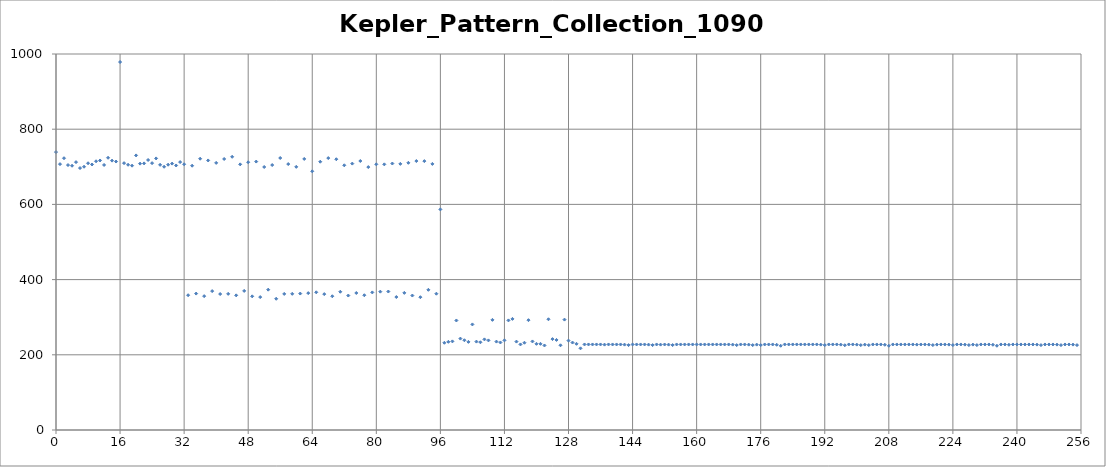
| Category | avg |
|---|---|
| 0.0 | 739.2 |
| 1.0 | 707.1 |
| 2.0 | 722.8 |
| 3.0 | 704.7 |
| 4.0 | 702.8 |
| 5.0 | 712.4 |
| 6.0 | 696.7 |
| 7.0 | 700.2 |
| 8.0 | 709.4 |
| 9.0 | 706.2 |
| 10.0 | 714.7 |
| 11.0 | 716.8 |
| 12.0 | 704.9 |
| 13.0 | 724 |
| 14.0 | 716.4 |
| 15.0 | 714 |
| 16.0 | 978.6 |
| 17.0 | 709.7 |
| 18.0 | 705.4 |
| 19.0 | 703 |
| 20.0 | 730.3 |
| 21.0 | 708.4 |
| 22.0 | 709.1 |
| 23.0 | 718.1 |
| 24.0 | 709.7 |
| 25.0 | 722.3 |
| 26.0 | 705.2 |
| 27.0 | 700.1 |
| 28.0 | 705.6 |
| 29.0 | 708.5 |
| 30.0 | 703.5 |
| 31.0 | 712.5 |
| 32.0 | 706.7 |
| 33.0 | 358.5 |
| 34.0 | 702.9 |
| 35.0 | 362.8 |
| 36.0 | 721.5 |
| 37.0 | 356 |
| 38.0 | 716.9 |
| 39.0 | 369.4 |
| 40.0 | 710.4 |
| 41.0 | 361.6 |
| 42.0 | 720.8 |
| 43.0 | 362.1 |
| 44.0 | 726.6 |
| 45.0 | 358.1 |
| 46.0 | 706.5 |
| 47.0 | 369.9 |
| 48.0 | 712.1 |
| 49.0 | 355.5 |
| 50.0 | 713.9 |
| 51.0 | 353.5 |
| 52.0 | 699.5 |
| 53.0 | 373.2 |
| 54.0 | 704.7 |
| 55.0 | 349 |
| 56.0 | 723.4 |
| 57.0 | 361.9 |
| 58.0 | 707.3 |
| 59.0 | 362.2 |
| 60.0 | 699.9 |
| 61.0 | 362.9 |
| 62.0 | 720.9 |
| 63.0 | 364 |
| 64.0 | 688 |
| 65.0 | 366.2 |
| 66.0 | 713.5 |
| 67.0 | 361.4 |
| 68.0 | 723.2 |
| 69.0 | 355.7 |
| 70.0 | 720.1 |
| 71.0 | 367.7 |
| 72.0 | 704 |
| 73.0 | 357.6 |
| 74.0 | 708.5 |
| 75.0 | 364.4 |
| 76.0 | 715.4 |
| 77.0 | 358.4 |
| 78.0 | 699.3 |
| 79.0 | 365.9 |
| 80.0 | 706.6 |
| 81.0 | 367.9 |
| 82.0 | 706.5 |
| 83.0 | 368.3 |
| 84.0 | 708.7 |
| 85.0 | 353.6 |
| 86.0 | 707.8 |
| 87.0 | 364.7 |
| 88.0 | 710.6 |
| 89.0 | 357.6 |
| 90.0 | 715.3 |
| 91.0 | 353.2 |
| 92.0 | 715.1 |
| 93.0 | 372.8 |
| 94.0 | 707.7 |
| 95.0 | 362.5 |
| 96.0 | 586.7 |
| 97.0 | 232 |
| 98.0 | 234.5 |
| 99.0 | 235.7 |
| 100.0 | 291.3 |
| 101.0 | 243.1 |
| 102.0 | 238.7 |
| 103.0 | 234.4 |
| 104.0 | 280.8 |
| 105.0 | 235.1 |
| 106.0 | 233.3 |
| 107.0 | 241 |
| 108.0 | 238.3 |
| 109.0 | 292.9 |
| 110.0 | 235.1 |
| 111.0 | 232.8 |
| 112.0 | 238.4 |
| 113.0 | 291.5 |
| 114.0 | 295.5 |
| 115.0 | 235.1 |
| 116.0 | 227.6 |
| 117.0 | 232.1 |
| 118.0 | 292.1 |
| 119.0 | 235.5 |
| 120.0 | 229.2 |
| 121.0 | 229.2 |
| 122.0 | 224.8 |
| 123.0 | 294.5 |
| 124.0 | 241.8 |
| 125.0 | 239.5 |
| 126.0 | 225.3 |
| 127.0 | 293.6 |
| 128.0 | 237.8 |
| 129.0 | 232.6 |
| 130.0 | 229.2 |
| 131.0 | 217.2 |
| 132.0 | 227.5 |
| 133.0 | 227.5 |
| 134.0 | 227.5 |
| 135.0 | 227.5 |
| 136.0 | 227.5 |
| 137.0 | 227.1 |
| 138.0 | 227.5 |
| 139.0 | 227.5 |
| 140.0 | 227.5 |
| 141.0 | 227.5 |
| 142.0 | 227.1 |
| 143.0 | 225.8 |
| 144.0 | 227.5 |
| 145.0 | 227.5 |
| 146.0 | 227.5 |
| 147.0 | 227.5 |
| 148.0 | 227.1 |
| 149.0 | 225.8 |
| 150.0 | 227.5 |
| 151.0 | 227.1 |
| 152.0 | 227.4 |
| 153.0 | 227.1 |
| 154.0 | 225.8 |
| 155.0 | 227.5 |
| 156.0 | 227.5 |
| 157.0 | 227.5 |
| 158.0 | 227.5 |
| 159.0 | 227.5 |
| 160.0 | 227.5 |
| 161.0 | 227.5 |
| 162.0 | 227.5 |
| 163.0 | 227.5 |
| 164.0 | 227.5 |
| 165.0 | 227.5 |
| 166.0 | 227.5 |
| 167.0 | 227.5 |
| 168.0 | 227.5 |
| 169.0 | 227.1 |
| 170.0 | 225.8 |
| 171.0 | 227.5 |
| 172.0 | 227.5 |
| 173.0 | 227.1 |
| 174.0 | 225.8 |
| 175.0 | 227.1 |
| 176.0 | 225.8 |
| 177.0 | 227.5 |
| 178.0 | 227.5 |
| 179.0 | 227.5 |
| 180.0 | 226.7 |
| 181.0 | 224.1 |
| 182.0 | 227.5 |
| 183.0 | 227.5 |
| 184.0 | 227.5 |
| 185.0 | 227.5 |
| 186.0 | 227.5 |
| 187.0 | 227.5 |
| 188.0 | 227.5 |
| 189.0 | 227.5 |
| 190.0 | 227.5 |
| 191.0 | 227.1 |
| 192.0 | 225.8 |
| 193.0 | 227.5 |
| 194.0 | 227.5 |
| 195.0 | 227.5 |
| 196.0 | 227.1 |
| 197.0 | 225.4 |
| 198.0 | 227.5 |
| 199.0 | 227.5 |
| 200.0 | 227.1 |
| 201.0 | 225.8 |
| 202.0 | 227.1 |
| 203.0 | 225.8 |
| 204.0 | 227.5 |
| 205.0 | 227.5 |
| 206.0 | 227.5 |
| 207.0 | 226.7 |
| 208.0 | 224.1 |
| 209.0 | 227.5 |
| 210.0 | 227.5 |
| 211.0 | 227.5 |
| 212.0 | 227.5 |
| 213.0 | 227.5 |
| 214.0 | 227.5 |
| 215.0 | 227.1 |
| 216.0 | 227.4 |
| 217.0 | 227.5 |
| 218.0 | 227.1 |
| 219.0 | 225.8 |
| 220.0 | 227.1 |
| 221.0 | 227.5 |
| 222.0 | 227.5 |
| 223.0 | 227.1 |
| 224.0 | 225.8 |
| 225.0 | 227.5 |
| 226.0 | 227.5 |
| 227.0 | 227.1 |
| 228.0 | 225.8 |
| 229.0 | 227.1 |
| 230.0 | 225.8 |
| 231.0 | 227.5 |
| 232.0 | 227.5 |
| 233.0 | 227.5 |
| 234.0 | 226.7 |
| 235.0 | 224.1 |
| 236.0 | 227.5 |
| 237.0 | 227.5 |
| 238.0 | 226.7 |
| 239.0 | 227.5 |
| 240.0 | 227.5 |
| 241.0 | 227.5 |
| 242.0 | 227.5 |
| 243.0 | 227.5 |
| 244.0 | 227.5 |
| 245.0 | 227.1 |
| 246.0 | 225.8 |
| 247.0 | 227.5 |
| 248.0 | 227.5 |
| 249.0 | 227.5 |
| 250.0 | 227.1 |
| 251.0 | 225.8 |
| 252.0 | 227.5 |
| 253.0 | 227.5 |
| 254.0 | 227.1 |
| 255.0 | 225.8 |